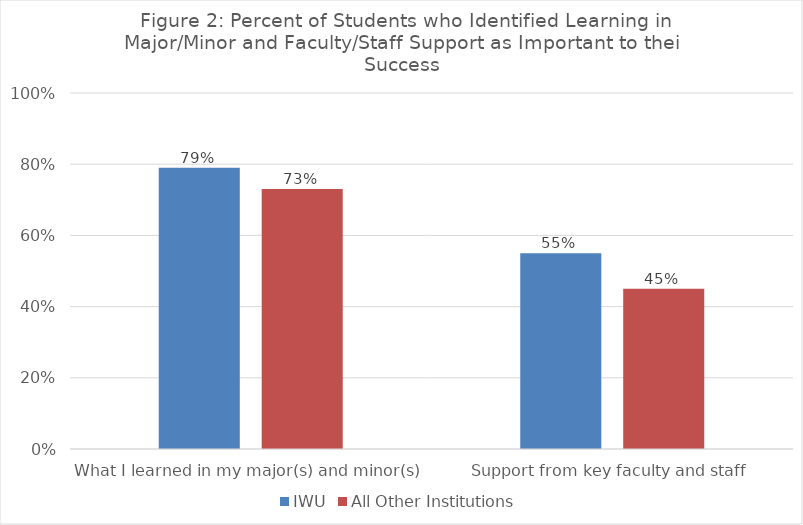
| Category | IWU | All Other Institutions |
|---|---|---|
| What I learned in my major(s) and minor(s) | 0.79 | 0.73 |
| Support from key faculty and staff | 0.55 | 0.45 |